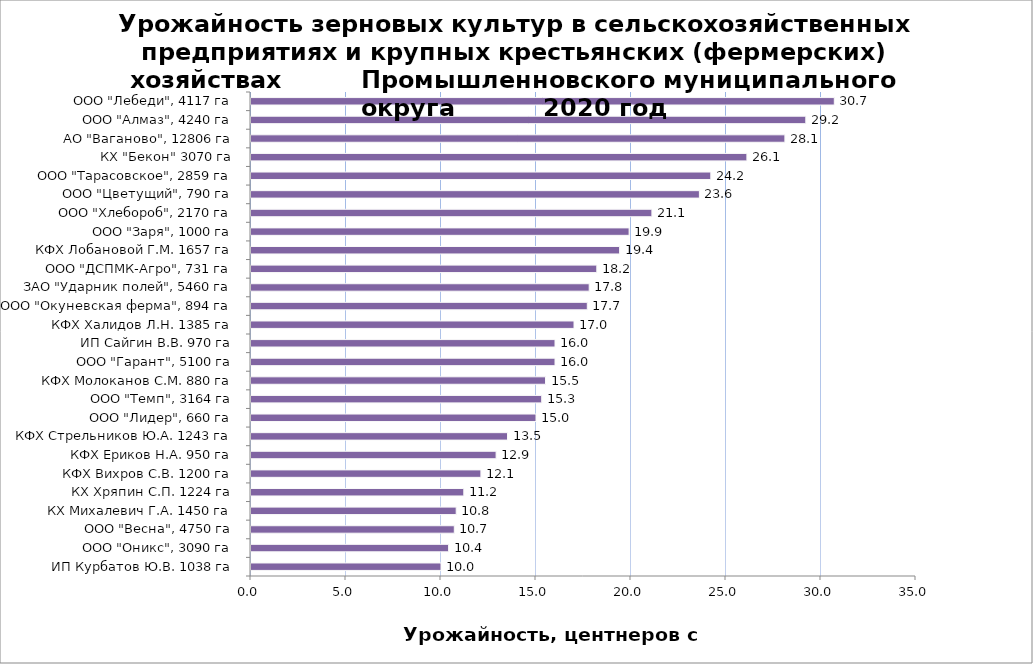
| Category | Series 0 |
|---|---|
| ИП Курбатов Ю.В. 1038 га | 10 |
| ООО "Оникс", 3090 га | 10.4 |
| ООО "Весна", 4750 га | 10.7 |
| КХ Михалевич Г.А. 1450 га | 10.8 |
| КХ Хряпин С.П. 1224 га | 11.2 |
| КФХ Вихров С.В. 1200 га | 12.1 |
| КФХ Ериков Н.А. 950 га | 12.9 |
| КФХ Стрельников Ю.А. 1243 га | 13.5 |
| ООО "Лидер", 660 га | 15 |
| ООО "Темп", 3164 га | 15.3 |
| КФХ Молоканов С.М. 880 га | 15.5 |
| ООО "Гарант", 5100 га | 16 |
| ИП Сайгин В.В. 970 га | 16 |
| КФХ Халидов Л.Н. 1385 га | 17 |
| ООО "Окуневская ферма", 894 га | 17.7 |
| ЗАО "Ударник полей", 5460 га | 17.8 |
| ООО "ДСПМК-Агро", 731 га | 18.2 |
| КФХ Лобановой Г.М. 1657 га | 19.4 |
| ООО "Заря", 1000 га | 19.9 |
| ООО "Хлебороб", 2170 га | 21.1 |
| ООО "Цветущий", 790 га | 23.6 |
| ООО "Тарасовское", 2859 га | 24.2 |
| КХ "Бекон" 3070 га | 26.1 |
| АО "Ваганово", 12806 га | 28.1 |
| ООО "Алмаз", 4240 га | 29.2 |
| ООО "Лебеди", 4117 га | 30.7 |